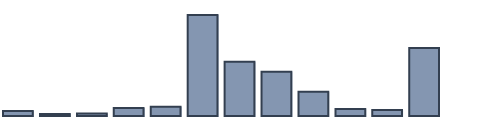
| Category | Series 0 |
|---|---|
| 0 | 1.524 |
| 1 | 0.617 |
| 2 | 0.729 |
| 3 | 2.415 |
| 4 | 2.828 |
| 5 | 30.486 |
| 6 | 16.374 |
| 7 | 13.326 |
| 8 | 7.295 |
| 9 | 2.08 |
| 10 | 1.807 |
| 11 | 20.52 |
| 12 | 0 |